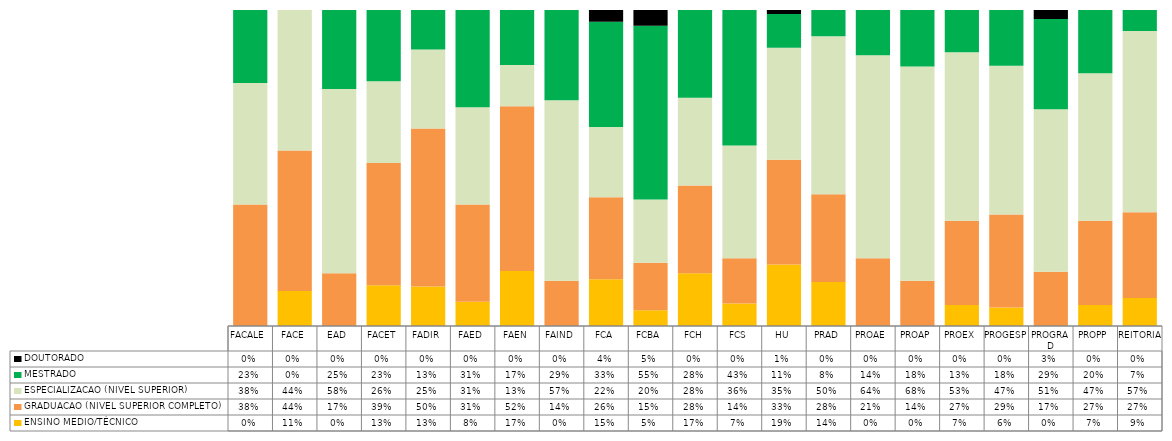
| Category | ENSINO MEDIO/TÉCNICO | GRADUACAO (NIVEL SUPERIOR COMPLETO) | ESPECIALIZACAO (NIVEL SUPERIOR)   | MESTRADO | DOUTORADO                             |
|---|---|---|---|---|---|
| FACALE | 0 | 0.385 | 0.385 | 0.231 | 0 |
| FACE | 0.111 | 0.444 | 0.444 | 0 | 0 |
| EAD | 0 | 0.167 | 0.583 | 0.25 | 0 |
| FACET | 0.129 | 0.387 | 0.258 | 0.226 | 0 |
| FADIR | 0.125 | 0.5 | 0.25 | 0.125 | 0 |
| FAED | 0.077 | 0.308 | 0.308 | 0.308 | 0 |
| FAEN | 0.174 | 0.522 | 0.13 | 0.174 | 0 |
| FAIND | 0 | 0.143 | 0.571 | 0.286 | 0 |
| FCA | 0.148 | 0.259 | 0.222 | 0.333 | 0.037 |
| FCBA | 0.05 | 0.15 | 0.2 | 0.55 | 0.05 |
| FCH | 0.167 | 0.278 | 0.278 | 0.278 | 0 |
| FCS | 0.071 | 0.143 | 0.357 | 0.429 | 0 |
| HU | 0.195 | 0.332 | 0.354 | 0.107 | 0.012 |
| PRAD | 0.139 | 0.278 | 0.5 | 0.083 | 0 |
| PROAE | 0 | 0.214 | 0.643 | 0.143 | 0 |
| PROAP | 0 | 0.143 | 0.679 | 0.179 | 0 |
| PROEX | 0.067 | 0.267 | 0.533 | 0.133 | 0 |
| PROGESP | 0.059 | 0.294 | 0.471 | 0.176 | 0 |
| PROGRAD | 0 | 0.171 | 0.514 | 0.286 | 0.029 |
| PROPP | 0.067 | 0.267 | 0.467 | 0.2 | 0 |
| REITORIA | 0.088 | 0.272 | 0.574 | 0.066 | 0 |